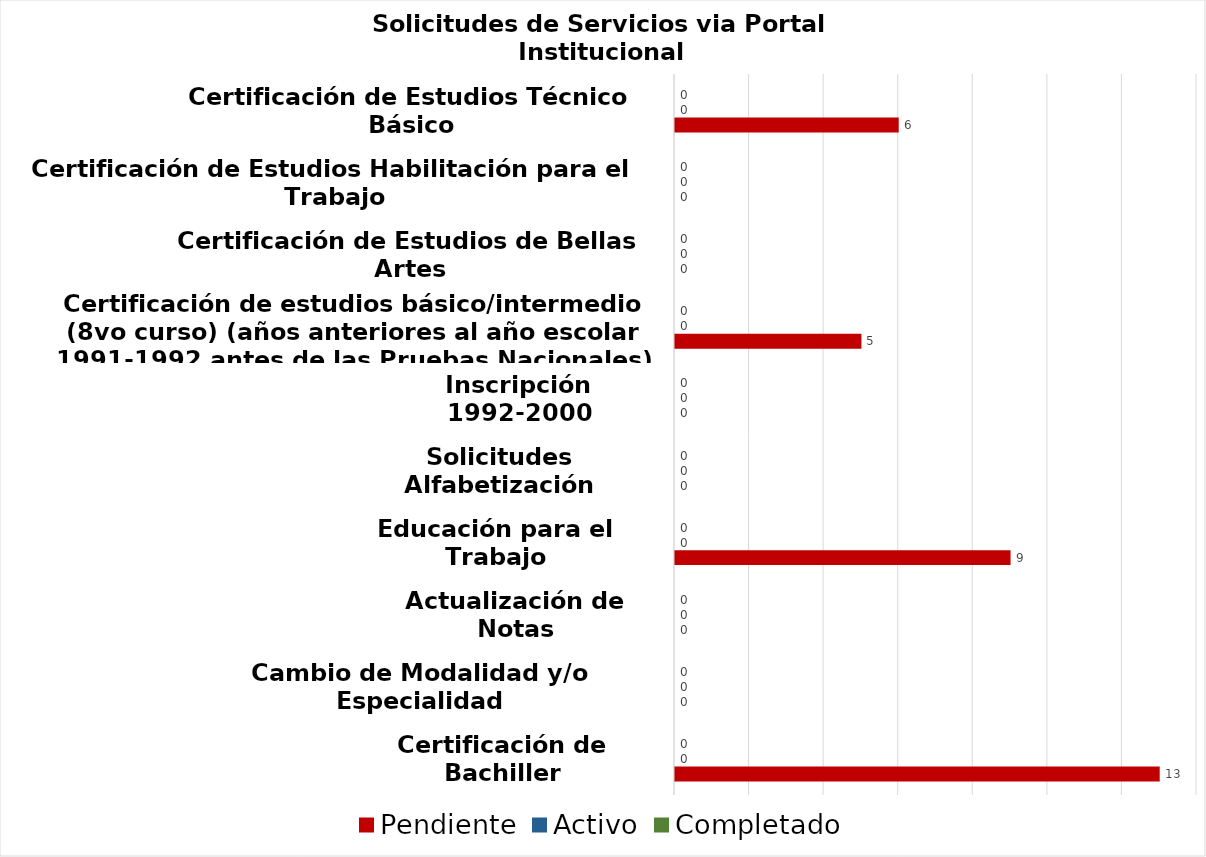
| Category | Pendiente | Activo | Completado |
|---|---|---|---|
| Certificación de Bachiller | 13 | 0 | 0 |
| Cambio de Modalidad y/o Especialidad | 0 | 0 | 0 |
| Actualización de Notas | 0 | 0 | 0 |
| Educación para el Trabajo | 9 | 0 | 0 |
| Solicitudes Alfabetización | 0 | 0 | 0 |
| Inscripción 1992-2000 | 0 | 0 | 0 |
| Certificación de estudios básico/intermedio (8vo curso) (años anteriores al año escolar 1991-1992 antes de las Pruebas Nacionales) | 5 | 0 | 0 |
| Certificación de Estudios de Bellas Artes | 0 | 0 | 0 |
| Certificación de Estudios Habilitación para el Trabajo | 0 | 0 | 0 |
| Certificación de Estudios Técnico Básico | 6 | 0 | 0 |